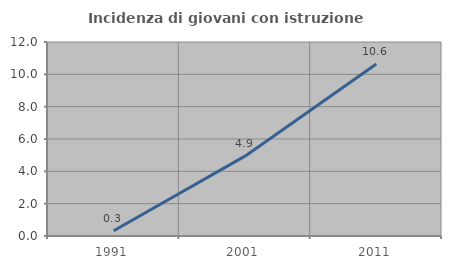
| Category | Incidenza di giovani con istruzione universitaria |
|---|---|
| 1991.0 | 0.322 |
| 2001.0 | 4.938 |
| 2011.0 | 10.645 |